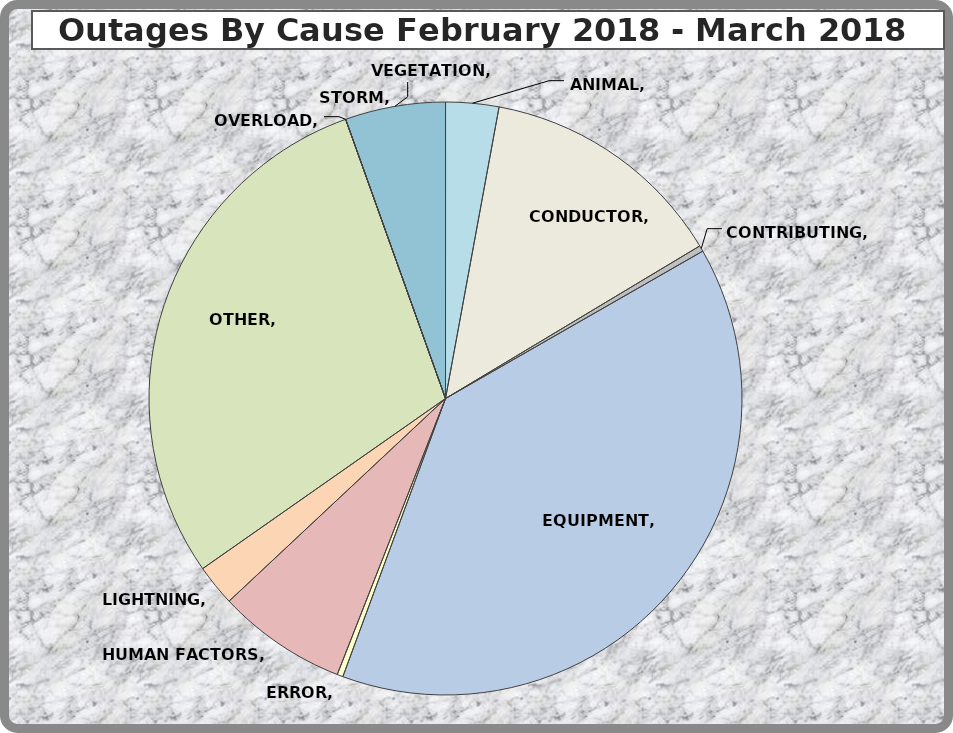
| Category | Series 0 |
|---|---|
| ANIMAL | 9 |
| CONDUCTOR | 42 |
| CONTRIBUTING | 1 |
| EQUIPMENT | 121 |
| ERROR | 1 |
| HUMAN FACTORS | 22 |
| LIGHTNING | 7 |
| OTHER | 91 |
| OVERLOAD | 0 |
| STORM | 0 |
| VEGETATION | 17 |